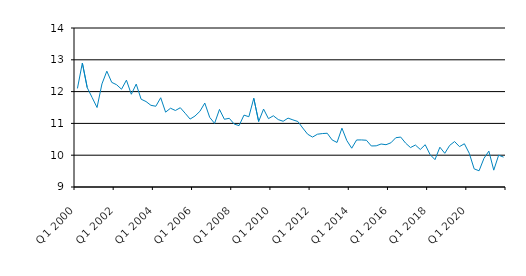
| Category | Series 0 |
|---|---|
| Q1 2000 | 12.1 |
| Q2 2000 | 12.899 |
| Q3 2000 | 12.125 |
| Q4 2000 | 11.812 |
| Q1 2001 | 11.5 |
| Q2 2001 | 12.241 |
| Q3 2001 | 12.642 |
| Q4 2001 | 12.291 |
| Q1 2002 | 12.215 |
| Q2 2002 | 12.075 |
| Q3 2002 | 12.36 |
| Q4 2002 | 11.917 |
| Q1 2003 | 12.236 |
| Q2 2003 | 11.761 |
| Q3 2003 | 11.688 |
| Q4 2003 | 11.569 |
| Q1 2004 | 11.539 |
| Q2 2004 | 11.807 |
| Q3 2004 | 11.354 |
| Q4 2004 | 11.477 |
| Q1 2005 | 11.406 |
| Q2 2005 | 11.493 |
| Q3 2005 | 11.318 |
| Q4 2005 | 11.136 |
| Q1 2006 | 11.231 |
| Q2 2006 | 11.38 |
| Q3 2006 | 11.64 |
| Q4 2006 | 11.19 |
| Q1 2007 | 11 |
| Q2 2007 | 11.44 |
| Q3 2007 | 11.13 |
| Q4 2007 | 11.16 |
| Q1 2008 | 10.98 |
| Q2 2008 | 10.93 |
| Q3 2008 | 11.26 |
| Q4 2008 | 11.21 |
| Q1 2009 | 11.79 |
| Q2 2009 | 11.06 |
| Q3 2009 | 11.45 |
| Q4 2009 | 11.15 |
| Q1 2010 | 11.24 |
| Q2 2010 | 11.12 |
| Q3 2010 | 11.067 |
| Q4 2010 | 11.166 |
| Q1 2011 | 11.11 |
| Q2 2011 | 11.06 |
| Q3 2011 | 10.855 |
| Q4 2011 | 10.66 |
| Q1 2012 | 10.57 |
| Q2 2012 | 10.66 |
| Q3 2012 | 10.68 |
| Q4 2012 | 10.69 |
| Q1 2013 | 10.48 |
| Q2 2013 | 10.4 |
| Q3 2013 | 10.85 |
| Q4 2013 | 10.46 |
| Q1 2014 | 10.22 |
| Q2 2014 | 10.479 |
| Q3 2014 | 10.48 |
| Q4 2014 | 10.47 |
| Q1 2015 | 10.29 |
| Q2 2015 | 10.295 |
| Q3 2015 | 10.352 |
| Q4 2015 | 10.33 |
| Q1 2016 | 10.39 |
| Q2 2016 | 10.55 |
| Q3 2016 | 10.57 |
| Q4 2016 | 10.38 |
| Q1 2017 | 10.24 |
| Q2 2017 | 10.32 |
| Q3 2017 | 10.18 |
| Q4 2017 | 10.33 |
| Q1 2018 | 10.02 |
| Q2 2018 | 9.86 |
| Q3 2018 | 10.251 |
| Q4 2018 | 10.06 |
| Q1 2019 | 10.308 |
| Q2 2019 | 10.429 |
| Q3 2019 | 10.27 |
| Q4 2019 | 10.36 |
| Q1 2020 | 10.06 |
| Q2 2020 | 9.57 |
| Q3 2020 | 9.51 |
| Q4 2020 | 9.9 |
| Q1 2021 | 10.128 |
| Q2 2021 | 9.53 |
| Q3 2021 | 10 |
| Q4 2021 | 9.94 |